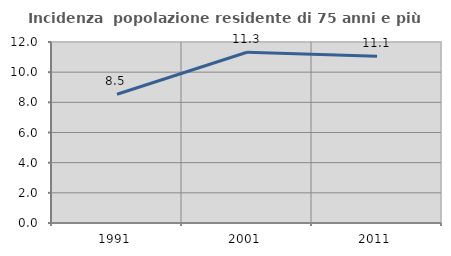
| Category | Incidenza  popolazione residente di 75 anni e più |
|---|---|
| 1991.0 | 8.537 |
| 2001.0 | 11.318 |
| 2011.0 | 11.06 |